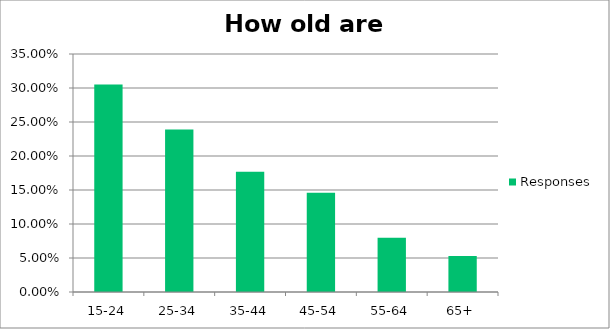
| Category | Responses |
|---|---|
| 15-24 | 0.305 |
| 25-34 | 0.239 |
| 35-44 | 0.177 |
| 45-54 | 0.146 |
| 55-64 | 0.08 |
| 65+ | 0.053 |